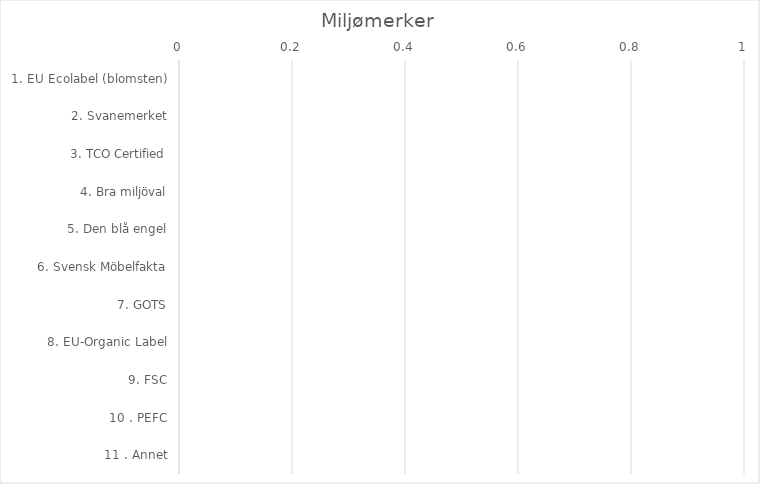
| Category | Antall |
|---|---|
| 1. EU Ecolabel (blomsten) | 0 |
| 2. Svanemerket | 0 |
| 3. TCO Certified | 0 |
| 4. Bra miljöval | 0 |
| 5. Den blå engel | 0 |
| 6. Svensk Möbelfakta | 0 |
| 7. GOTS | 0 |
| 8. EU-Organic Label | 0 |
| 9. FSC | 0 |
| 10 . PEFC | 0 |
| 11 . Annet | 0 |